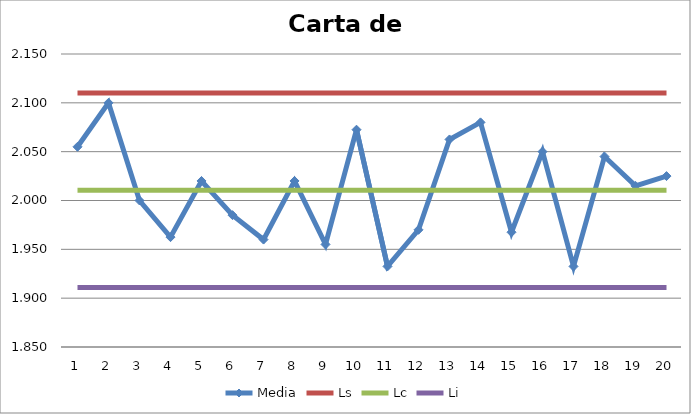
| Category | Media | Ls | Lc | Li |
|---|---|---|---|---|
| 0 | 2.055 | 2.11 | 2.01 | 1.911 |
| 1 | 2.1 | 2.11 | 2.01 | 1.911 |
| 2 | 2 | 2.11 | 2.01 | 1.911 |
| 3 | 1.962 | 2.11 | 2.01 | 1.911 |
| 4 | 2.02 | 2.11 | 2.01 | 1.911 |
| 5 | 1.985 | 2.11 | 2.01 | 1.911 |
| 6 | 1.96 | 2.11 | 2.01 | 1.911 |
| 7 | 2.02 | 2.11 | 2.01 | 1.911 |
| 8 | 1.955 | 2.11 | 2.01 | 1.911 |
| 9 | 2.072 | 2.11 | 2.01 | 1.911 |
| 10 | 1.932 | 2.11 | 2.01 | 1.911 |
| 11 | 1.97 | 2.11 | 2.01 | 1.911 |
| 12 | 2.062 | 2.11 | 2.01 | 1.911 |
| 13 | 2.08 | 2.11 | 2.01 | 1.911 |
| 14 | 1.968 | 2.11 | 2.01 | 1.911 |
| 15 | 2.05 | 2.11 | 2.01 | 1.911 |
| 16 | 1.932 | 2.11 | 2.01 | 1.911 |
| 17 | 2.045 | 2.11 | 2.01 | 1.911 |
| 18 | 2.015 | 2.11 | 2.01 | 1.911 |
| 19 | 2.025 | 2.11 | 2.01 | 1.911 |